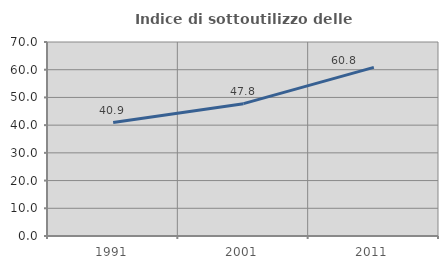
| Category | Indice di sottoutilizzo delle abitazioni  |
|---|---|
| 1991.0 | 40.933 |
| 2001.0 | 47.753 |
| 2011.0 | 60.843 |